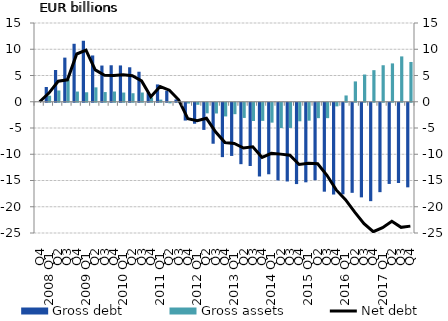
| Category | Gross debt | Gross assets |
|---|---|---|
| Q4 | 0 | 0 |
| 2008 Q1 | 2.805 | 1.155 |
| Q2 | 6.047 | 2.144 |
| Q3 | 8.406 | 4.231 |
| Q4 | 11.042 | 1.944 |
| 2009 Q1 | 11.619 | 1.806 |
| Q2 | 8.818 | 2.746 |
| Q3 | 6.896 | 1.845 |
| Q4 | 6.949 | 1.95 |
| 2010 Q1 | 6.917 | 1.755 |
| Q2 | 6.567 | 1.624 |
| Q3 | 5.717 | 1.759 |
| Q4 | 1.77 | 0.814 |
| 2011 Q1 | 3.302 | 0.409 |
| Q2 | 2.097 | -0.111 |
| Q3 | 0.433 | 0.067 |
| Q4 | -3.394 | -0.148 |
| 2012 Q1 | -4 | -0.387 |
| Q2 | -5.171 | -2.014 |
| Q3 | -7.808 | -2.044 |
| Q4 | -10.358 | -2.605 |
| 2013 Q1 | -10.129 | -2.176 |
| Q2 | -11.7 | -2.894 |
| Q3 | -12.051 | -3.475 |
| Q4 | -14.044 | -3.451 |
| 2014 Q1 | -13.623 | -3.789 |
| Q2 | -14.796 | -4.82 |
| Q3 | -14.997 | -4.797 |
| Q4 | -15.49 | -3.532 |
| 2015 Q1 | -15.157 | -3.419 |
| Q2 | -14.758 | -2.933 |
| Q3 | -16.939 | -2.933 |
| Q4 | -17.484 | -0.69 |
| 2016 Q1 | -17.44 | 1.197 |
| Q2 | -17.159 | 3.873 |
| Q3 | -18.021 | 5.187 |
| Q4 | -18.744 | 6.014 |
| 2017 Q1 | -17.03 | 6.955 |
| Q2 | -15.466 | 7.304 |
| Q3 | -15.286 | 8.638 |
| Q4 | -16.112 | 7.579 |